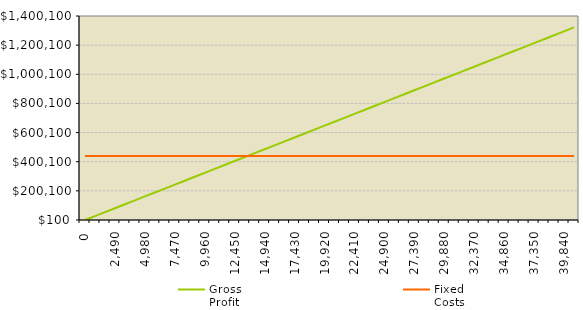
| Category | Gross
Profit | Fixed
Costs |
|---|---|---|
| 0.0 | 0 | 439068.5 |
| 830.0 | 26975 | 439068.5 |
| 1660.0 | 53950 | 439068.5 |
| 2490.0 | 80925 | 439068.5 |
| 3320.0 | 107900 | 439068.5 |
| 4150.0 | 134875 | 439068.5 |
| 4980.0 | 161850 | 439068.5 |
| 5810.0 | 188825 | 439068.5 |
| 6640.0 | 215800 | 439068.5 |
| 7470.0 | 242775 | 439068.5 |
| 8300.0 | 269750 | 439068.5 |
| 9130.0 | 296725 | 439068.5 |
| 9960.0 | 323700 | 439068.5 |
| 10790.0 | 350675 | 439068.5 |
| 11620.0 | 377650 | 439068.5 |
| 12450.0 | 404625 | 439068.5 |
| 13280.0 | 431600 | 439068.5 |
| 14110.0 | 458575 | 439068.5 |
| 14940.0 | 485550 | 439068.5 |
| 15770.0 | 512525 | 439068.5 |
| 16600.0 | 539500 | 439068.5 |
| 17430.0 | 566475 | 439068.5 |
| 18260.0 | 593450 | 439068.5 |
| 19090.0 | 620425 | 439068.5 |
| 19920.0 | 647400 | 439068.5 |
| 20750.0 | 674375 | 439068.5 |
| 21580.0 | 701350 | 439068.5 |
| 22410.0 | 728325 | 439068.5 |
| 23240.0 | 755300 | 439068.5 |
| 24070.0 | 782275 | 439068.5 |
| 24900.0 | 809250 | 439068.5 |
| 25730.0 | 836225 | 439068.5 |
| 26560.0 | 863200 | 439068.5 |
| 27390.0 | 890175 | 439068.5 |
| 28220.0 | 917150 | 439068.5 |
| 29050.0 | 944125 | 439068.5 |
| 29880.0 | 971100 | 439068.5 |
| 30710.0 | 998075 | 439068.5 |
| 31540.0 | 1025050 | 439068.5 |
| 32370.0 | 1052025 | 439068.5 |
| 33200.0 | 1079000 | 439068.5 |
| 34030.0 | 1105975 | 439068.5 |
| 34860.0 | 1132950 | 439068.5 |
| 35690.0 | 1159925 | 439068.5 |
| 36520.0 | 1186900 | 439068.5 |
| 37350.0 | 1213875 | 439068.5 |
| 38180.0 | 1240850 | 439068.5 |
| 39010.0 | 1267825 | 439068.5 |
| 39840.0 | 1294800 | 439068.5 |
| 40670.0 | 1321775 | 439068.5 |